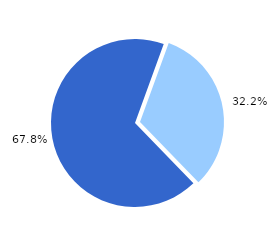
| Category | Series 0 |
|---|---|
| Personen im Alter von 65 und mehr Jahren | 5143 |
| Personen im Alter von 18 bis unter 65 Jahren  | 10827 |